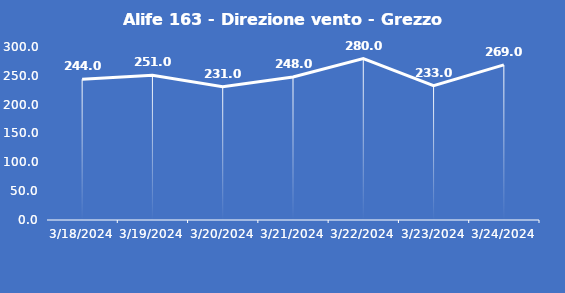
| Category | Alife 163 - Direzione vento - Grezzo (°N) |
|---|---|
| 3/18/24 | 244 |
| 3/19/24 | 251 |
| 3/20/24 | 231 |
| 3/21/24 | 248 |
| 3/22/24 | 280 |
| 3/23/24 | 233 |
| 3/24/24 | 269 |